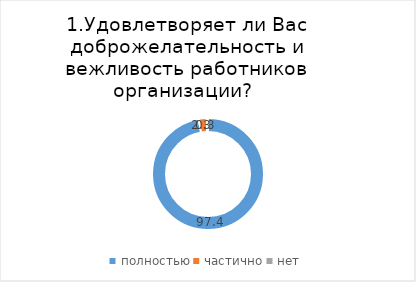
| Category | Первомайский |
|---|---|
| полностью | 97.368 |
| частично | 2.303 |
| нет | 0.329 |